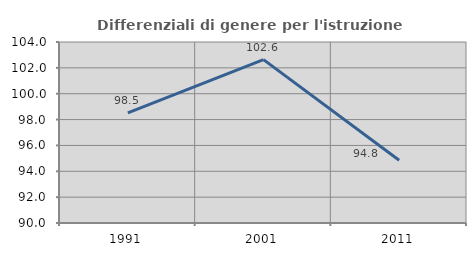
| Category | Differenziali di genere per l'istruzione superiore |
|---|---|
| 1991.0 | 98.522 |
| 2001.0 | 102.634 |
| 2011.0 | 94.848 |